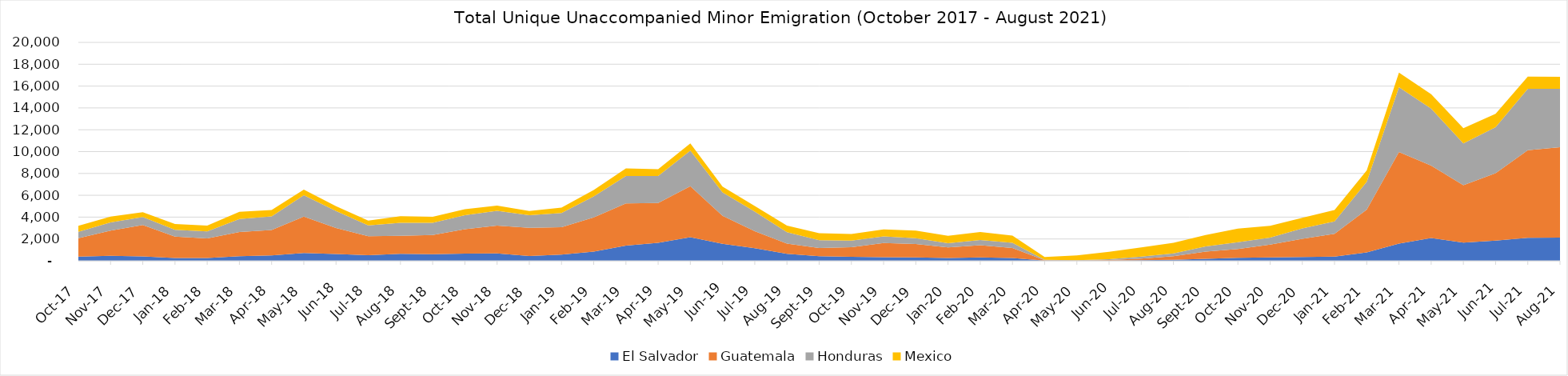
| Category | El Salvador | Guatemala | Honduras |  Mexico  |
|---|---|---|---|---|
| 2017-10-01 | 392 | 1683 | 589 | 545.025 |
| 2017-11-01 | 455 | 2315 | 752 | 530.925 |
| 2017-12-01 | 404 | 2881 | 720 | 436.425 |
| 2018-01-01 | 253 | 1963 | 628 | 524.55 |
| 2018-02-01 | 264 | 1782 | 647 | 531 |
| 2018-03-01 | 420 | 2217 | 1184 | 673.975 |
| 2018-04-01 | 497 | 2328 | 1232 | 594.55 |
| 2018-05-01 | 717 | 3333 | 1952 | 515.775 |
| 2018-06-01 | 624 | 2383 | 1558 | 429.2 |
| 2018-07-01 | 512 | 1735 | 996 | 445.4 |
| 2018-08-01 | 642 | 1646 | 1190 | 604.425 |
| 2018-09-01 | 602 | 1752 | 1120 | 549.45 |
| 2018-10-01 | 651 | 2237 | 1287 | 552.6 |
| 2018-11-01 | 671 | 2556 | 1343 | 486.15 |
| 2018-12-01 | 442 | 2581 | 1151 | 388.4 |
| 2019-01-01 | 574 | 2502 | 1295 | 508.075 |
| 2019-02-01 | 847 | 3128 | 1931 | 579.95 |
| 2019-03-01 | 1385 | 3873 | 2506 | 701.075 |
| 2019-04-01 | 1643 | 3652 | 2473 | 615.425 |
| 2019-05-01 | 2167 | 4670 | 3253 | 656 |
| 2019-06-01 | 1554 | 2573 | 2132 | 534.675 |
| 2019-07-01 | 1162 | 1551 | 1788 | 513.3 |
| 2019-08-01 | 638 | 928 | 1047 | 605.35 |
| 2019-09-01 | 427 | 745 | 723 | 627.025 |
| 2019-10-01 | 369 | 877 | 599 | 604.575 |
| 2019-11-01 | 329 | 1295 | 614 | 641.625 |
| 2019-12-01 | 306 | 1240 | 529 | 692.325 |
| 2020-01-01 | 249 | 976 | 381 | 680.375 |
| 2020-02-01 | 313 | 1113 | 487 | 724.725 |
| 2020-03-01 | 254 | 912.6 | 480.6 | 667.525 |
| 2020-04-01 | 12.4 | 46.6 | 25.6 | 270.125 |
| 2020-05-01 | 4.6 | 18.8 | 24.8 | 437.7 |
| 2020-06-01 | 21.2 | 43.6 | 83.2 | 668.075 |
| 2020-07-01 | 46 | 159.2 | 182 | 844.925 |
| 2020-08-01 | 100.2 | 327.4 | 250 | 969.625 |
| 2020-09-01 | 182 | 666.6 | 474.2 | 1048.525 |
| 2020-10-01 | 267.4 | 808 | 635.4 | 1239.525 |
| 2020-11-01 | 310.6 | 1171.6 | 650.2 | 1075.95 |
| 2020-12-01 | 356 | 1664 | 946 | 979.525 |
| 2021-01-01 | 391 | 2074 | 1149 | 1046.025 |
| 2021-02-01 | 770 | 3911.4 | 2561.4 | 1043.6 |
| 2021-03-01 | 1580 | 8375 | 5947 | 1335.35 |
| 2021-04-01 | 2093.4 | 6628 | 5209 | 1327.7 |
| 2021-05-01 | 1670 | 5255 | 3821 | 1388.625 |
| 2021-06-01 | 1846 | 6181 | 4205 | 1231.675 |
| 2021-07-01 | 2114 | 8015 | 5625 | 1115.725 |
| 2021-08-01 | 2115.4 | 8279.6 | 5346.8 | 1104.575 |